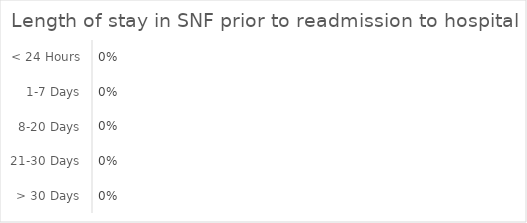
| Category | Series 0 |
|---|---|
| < 24 Hours | 0 |
| 1-7 Days | 0 |
| 8-20 Days | 0 |
| 21-30 Days | 0 |
| > 30 Days | 0 |